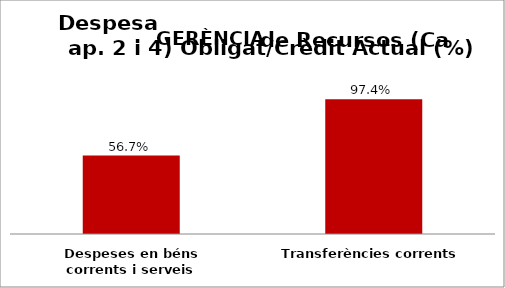
| Category | Series 0 |
|---|---|
| Despeses en béns corrents i serveis | 0.567 |
| Transferències corrents | 0.974 |